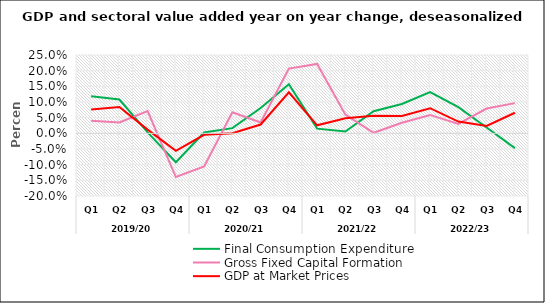
| Category | Final Consumption Expenditure | Gross Fixed Capital Formation | GDP at Market Prices |
|---|---|---|---|
| 0 | 0.118 | 0.04 | 0.076 |
| 1 | 0.108 | 0.035 | 0.084 |
| 2 | 0.003 | 0.071 | 0.012 |
| 3 | -0.092 | -0.14 | -0.056 |
| 4 | 0.003 | -0.106 | -0.005 |
| 5 | 0.017 | 0.067 | 0 |
| 6 | 0.081 | 0.035 | 0.028 |
| 7 | 0.157 | 0.207 | 0.131 |
| 8 | 0.015 | 0.221 | 0.026 |
| 9 | 0.006 | 0.06 | 0.048 |
| 10 | 0.071 | 0.002 | 0.056 |
| 11 | 0.094 | 0.034 | 0.056 |
| 12 | 0.131 | 0.059 | 0.08 |
| 13 | 0.084 | 0.03 | 0.038 |
| 14 | 0.019 | 0.079 | 0.023 |
| 15 | -0.047 | 0.096 | 0.066 |